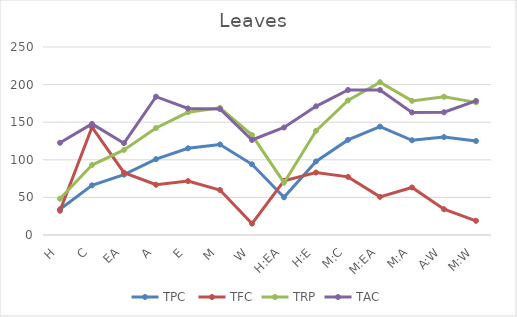
| Category | TPC  | TFC | TRP | TAC |
|---|---|---|---|---|
| H | 34.292 | 32.236 | 48.253 | 122.607 |
| C | 66.053 | 143.497 | 93.036 | 147.802 |
| EA | 80.321 | 82.868 | 113.204 | 122.125 |
| A | 100.861 | 66.807 | 142.256 | 183.912 |
| E | 115.274 | 71.645 | 163.188 | 168.245 |
| M | 120.389 | 59.861 | 169.16 | 167.545 |
| W | 94.006 | 15.149 | 132.922 | 126.35 |
| H:EA | 50.165 | 71.95 | 69.533 | 142.939 |
| H:E | 97.782 | 83.089 | 138.48 | 171.139 |
| M:C | 126.466 | 77.315 | 178.922 | 192.814 |
| M:EA | 144.133 | 50.731 | 203.271 | 192.743 |
| M:A | 125.986 | 63.228 | 178.316 | 162.975 |
| A:W | 130.186 | 34.287 | 183.824 | 163.199 |
| M:W | 124.959 | 18.847 | 176.347 | 178.302 |